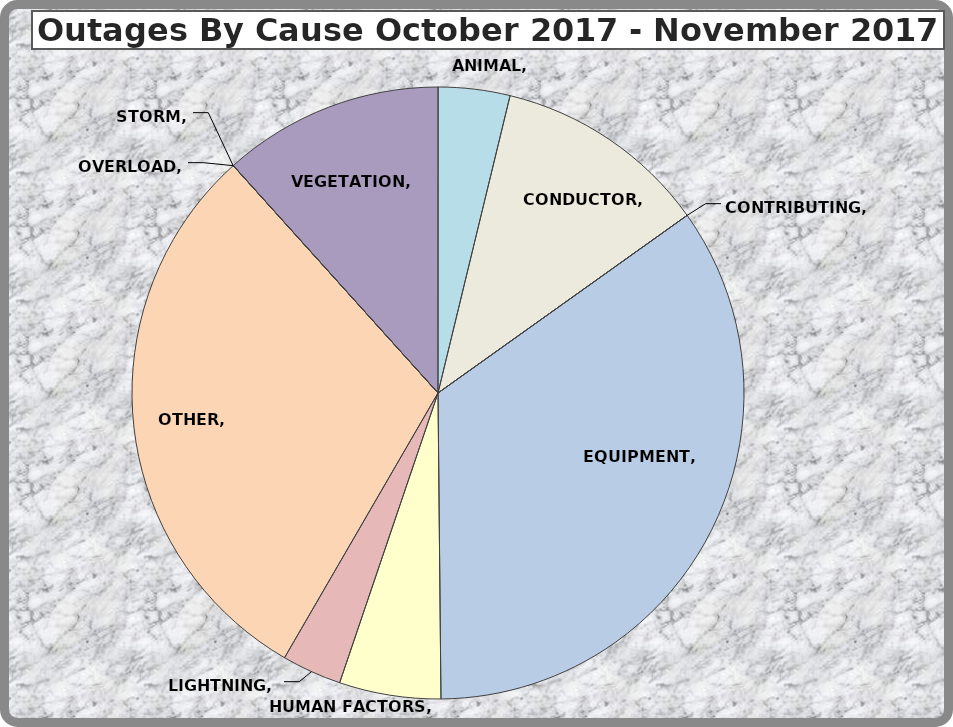
| Category | Series 0 |
|---|---|
| ANIMAL | 12 |
| CONDUCTOR | 36 |
| CONTRIBUTING | 0 |
| EQUIPMENT | 110 |
| HUMAN FACTORS | 17 |
| LIGHTNING | 10 |
| OTHER | 95 |
| OVERLOAD | 0 |
| STORM | 0 |
| VEGETATION | 37 |